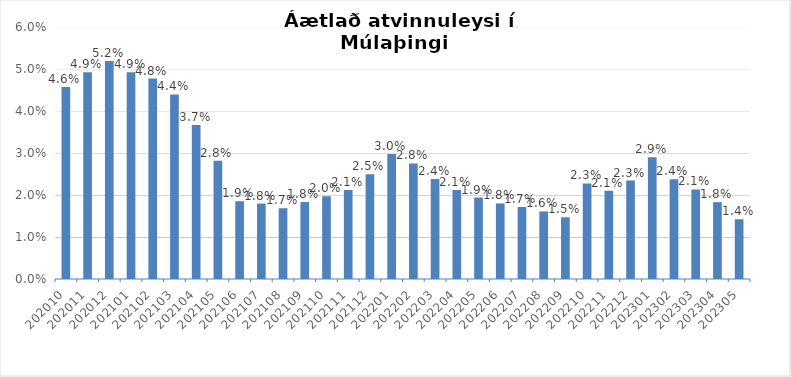
| Category | Áætlað atvinnuleysi |
|---|---|
| 202010.0 | 0.046 |
| 202011.0 | 0.049 |
| 202012.0 | 0.052 |
| 202101.0 | 0.049 |
| 202102.0 | 0.048 |
| 202103.0 | 0.044 |
| 202104.0 | 0.037 |
| 202105.0 | 0.028 |
| 202106.0 | 0.019 |
| 202107.0 | 0.018 |
| 202108.0 | 0.017 |
| 202109.0 | 0.018 |
| 202110.0 | 0.02 |
| 202111.0 | 0.021 |
| 202112.0 | 0.025 |
| 202201.0 | 0.03 |
| 202202.0 | 0.028 |
| 202203.0 | 0.024 |
| 202204.0 | 0.021 |
| 202205.0 | 0.019 |
| 202206.0 | 0.018 |
| 202207.0 | 0.017 |
| 202208.0 | 0.016 |
| 202209.0 | 0.015 |
| 202210.0 | 0.023 |
| 202211.0 | 0.021 |
| 202212.0 | 0.023 |
| 202301.0 | 0.029 |
| 202302.0 | 0.024 |
| 202303.0 | 0.021 |
| 202304.0 | 0.018 |
| 202305.0 | 0.014 |